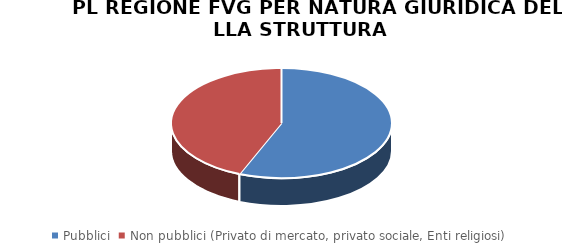
| Category | Series 0 |
|---|---|
| Pubblici | 5876 |
| Non pubblici (Privato di mercato, privato sociale, Enti religiosi) | 4578 |